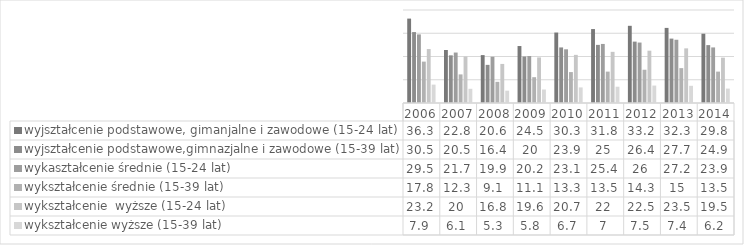
| Category | wyjształcenie podstawowe, gimanjalne i zawodowe (15-24 lat) | wyjształcenie podstawowe,gimnazjalne i zawodowe (15-39 lat) | wykaształcenie średnie (15-24 lat) | wykształcenie średnie (15-39 lat) | wykształcenie  wyższe (15-24 lat) | wykształcenie wyższe (15-39 lat) |
|---|---|---|---|---|---|---|
| 2006.0 | 36.3 | 30.5 | 29.5 | 17.8 | 23.2 | 7.9 |
| 2007.0 | 22.8 | 20.5 | 21.7 | 12.3 | 20 | 6.1 |
| 2008.0 | 20.6 | 16.4 | 19.9 | 9.1 | 16.8 | 5.3 |
| 2009.0 | 24.5 | 20 | 20.2 | 11.1 | 19.6 | 5.8 |
| 2010.0 | 30.3 | 23.9 | 23.1 | 13.3 | 20.7 | 6.7 |
| 2011.0 | 31.8 | 25 | 25.4 | 13.5 | 22 | 7 |
| 2012.0 | 33.2 | 26.4 | 26 | 14.3 | 22.5 | 7.5 |
| 2013.0 | 32.3 | 27.7 | 27.2 | 15 | 23.5 | 7.4 |
| 2014.0 | 29.8 | 24.9 | 23.9 | 13.5 | 19.5 | 6.2 |